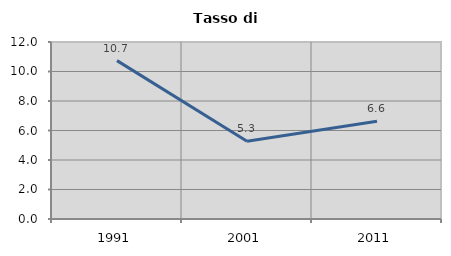
| Category | Tasso di disoccupazione   |
|---|---|
| 1991.0 | 10.737 |
| 2001.0 | 5.274 |
| 2011.0 | 6.628 |